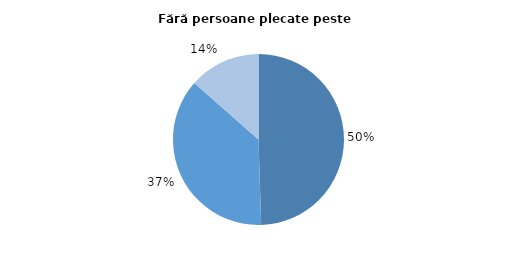
| Category | Fără migranți |
|---|---|
| 0 | 49.504 |
| 1 | 36.979 |
| 2 | 13.517 |